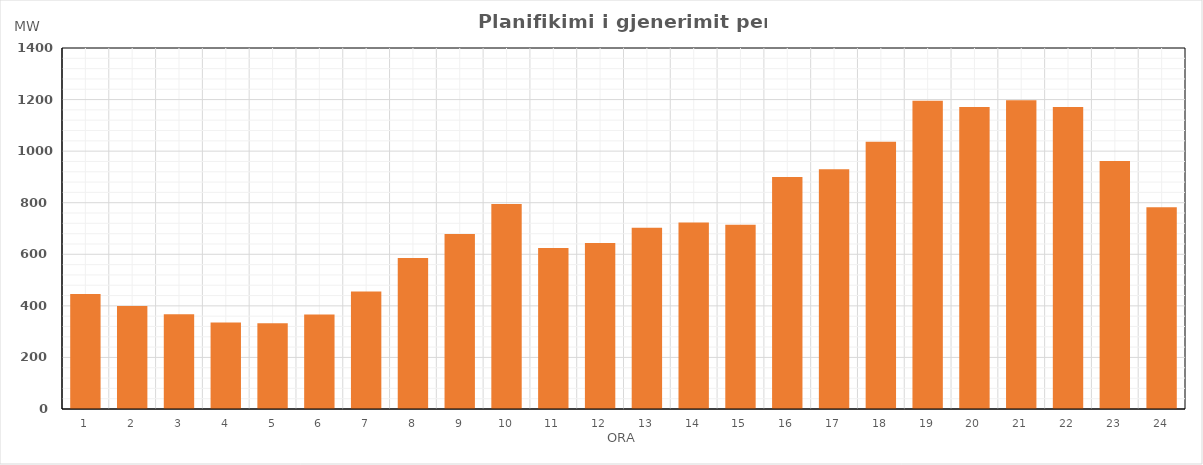
| Category | Max (MW) |
|---|---|
| 0 | 446.18 |
| 1 | 399.5 |
| 2 | 367.22 |
| 3 | 335.62 |
| 4 | 332.11 |
| 5 | 366.12 |
| 6 | 455.25 |
| 7 | 585.38 |
| 8 | 679.11 |
| 9 | 795.27 |
| 10 | 624.26 |
| 11 | 644.03 |
| 12 | 702.53 |
| 13 | 723.45 |
| 14 | 714.44 |
| 15 | 899.65 |
| 16 | 930.04 |
| 17 | 1036.06 |
| 18 | 1195.87 |
| 19 | 1171.57 |
| 20 | 1197.7 |
| 21 | 1170.86 |
| 22 | 961.77 |
| 23 | 782.69 |